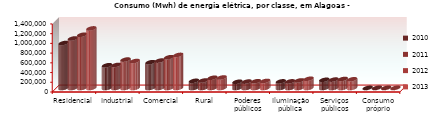
| Category | 2010 | 2011 | 2012 | 2013 |
|---|---|---|---|---|
| Residencial | 924749 | 1018469 | 1094798.074 | 1225494 |
| Industrial | 467649 | 474211 | 584373.588 | 554697 |
| Comercial | 530211 | 563923 | 633332.685 | 680412 |
| Rural | 147678 | 153176 | 210218.054 | 216079 |
| Poderes públicos | 127960 | 131721 | 138798.477 | 145272 |
| Iluminação pública | 136066 | 136146 | 155556.71 | 189829 |
| Serviços públicos | 168547 | 172749 | 185652.632 | 179167 |
| Consumo próprio | 2596 | 4144 | 4242.577 | 3713 |